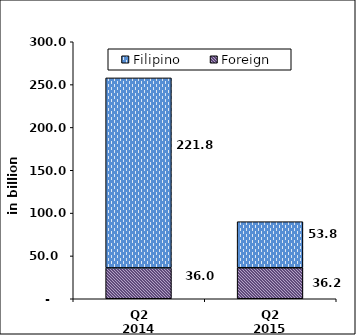
| Category | Foreign | Filipino |
|---|---|---|
| Q2 2014 | 36.031 | 221.797 |
| Q2 2015 | 36.211 | 53.764 |